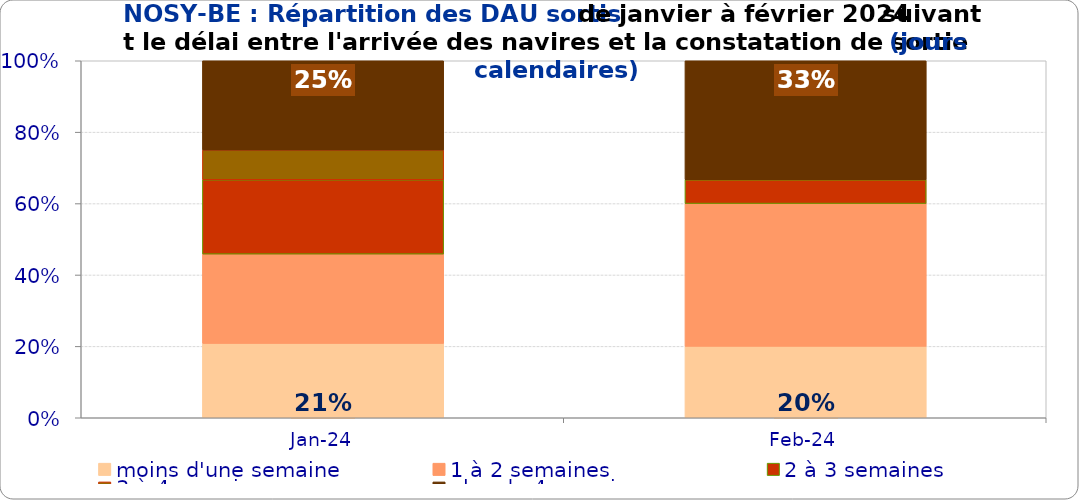
| Category | moins d'une semaine | 1 à 2 semaines | 2 à 3 semaines | 3 à 4 semaines | plus de 4 semaines |
|---|---|---|---|---|---|
| 2024-01-01 | 0.208 | 0.25 | 0.208 | 0.083 | 0.25 |
| 2024-02-01 | 0.2 | 0.4 | 0.067 | 0 | 0.333 |